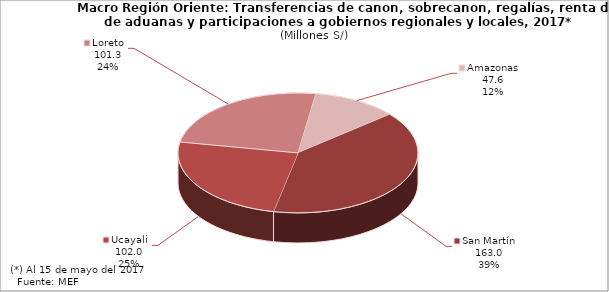
| Category | Series 1 |
|---|---|
| San Martín | 162.989 |
| Ucayali | 102.012 |
| Loreto | 101.31 |
| Amazonas | 47.616 |